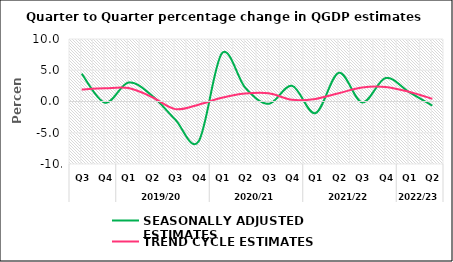
| Category | SEASONALLY ADJUSTED ESTIMATES | TREND CYCLE ESTIMATES |
|---|---|---|
| 0 | 4.45 | 1.933 |
| 1 | -0.201 | 2.107 |
| 2 | 3.037 | 2.148 |
| 3 | 0.972 | 0.725 |
| 4 | -2.872 | -1.22 |
| 5 | -6.4 | -0.505 |
| 6 | 7.717 | 0.603 |
| 7 | 2.186 | 1.272 |
| 8 | -0.373 | 1.318 |
| 9 | 2.516 | 0.267 |
| 10 | -1.863 | 0.414 |
| 11 | 4.592 | 1.33 |
| 12 | -0.146 | 2.242 |
| 13 | 3.755 | 2.319 |
| 14 | 1.523 | 1.559 |
| 15 | -0.656 | 0.439 |